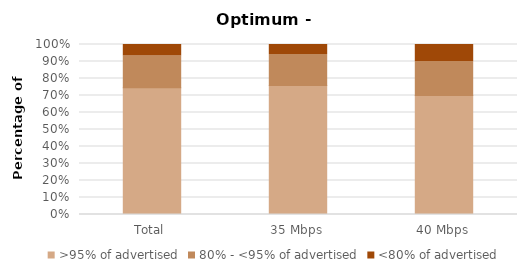
| Category | >95% of advertised | 80% - <95% of advertised | <80% of advertised |
|---|---|---|---|
| Total | 0.746 | 0.186 | 0.068 |
| 35 Mbps | 0.759 | 0.182 | 0.058 |
| 40 Mbps | 0.7 | 0.2 | 0.1 |